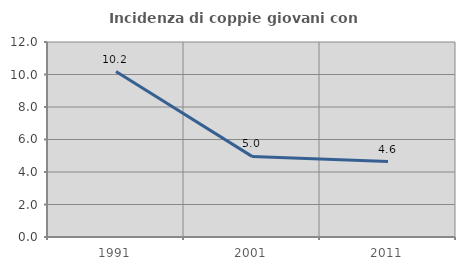
| Category | Incidenza di coppie giovani con figli |
|---|---|
| 1991.0 | 10.18 |
| 2001.0 | 4.961 |
| 2011.0 | 4.644 |